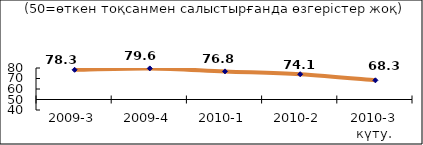
| Category | Диф.индекс ↓ |
|---|---|
| 2009-3 | 78.28 |
| 2009-4 | 79.6 |
| 2010-1 | 76.775 |
| 2010-2 | 74.07 |
| 2010-3 күту. | 68.26 |